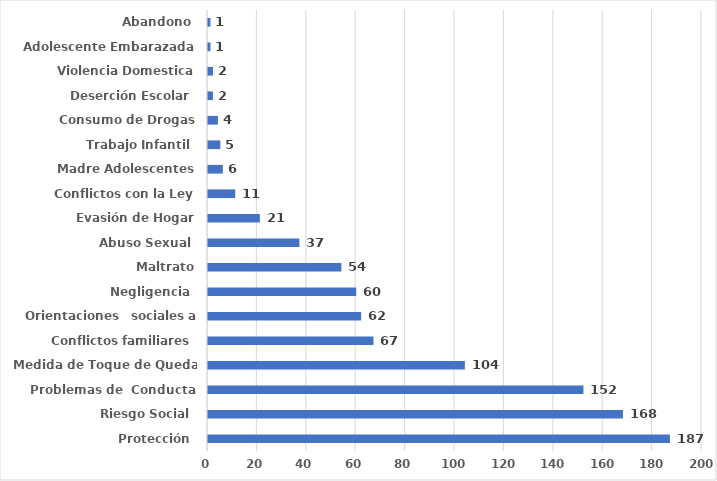
| Category | Series 0 |
|---|---|
| Protección  | 187 |
| Riesgo Social  | 168 |
| Problemas de  Conducta | 152 |
| Medida de Toque de Queda  | 104 |
| Conflictos familiares  | 67 |
| Orientaciones   sociales a NNA | 62 |
| Negligencia  | 60 |
| Maltrato | 54 |
| Abuso Sexual  | 37 |
| Evasión de Hogar | 21 |
| Conflictos con la Ley | 11 |
| Madre Adolescentes | 6 |
| Trabajo Infantil  | 5 |
| Consumo de Drogas | 4 |
| Deserción Escolar  | 2 |
| Violencia Domestica | 2 |
| Adolescente Embarazada | 1 |
| Abandono  | 1 |